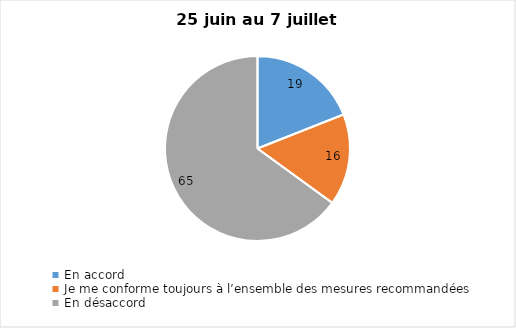
| Category | Series 0 |
|---|---|
| En accord | 19 |
| Je me conforme toujours à l’ensemble des mesures recommandées | 16 |
| En désaccord | 65 |